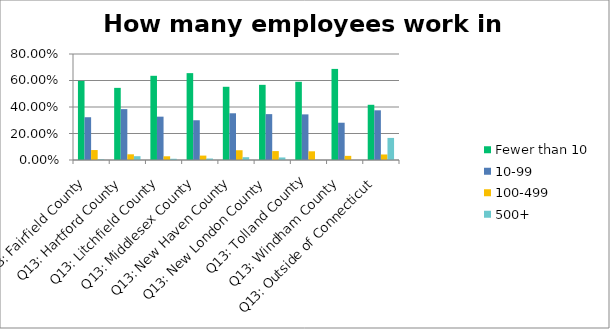
| Category | Fewer than 10 | 10-99 | 100-499 | 500+ |
|---|---|---|---|---|
| Q13: Fairfield County | 0.597 | 0.323 | 0.075 | 0.005 |
| Q13: Hartford County | 0.544 | 0.384 | 0.043 | 0.029 |
| Q13: Litchfield County | 0.636 | 0.327 | 0.028 | 0.009 |
| Q13: Middlesex County | 0.656 | 0.3 | 0.033 | 0.011 |
| Q13: New Haven County | 0.553 | 0.353 | 0.074 | 0.021 |
| Q13: New London County | 0.567 | 0.346 | 0.067 | 0.019 |
| Q13: Tolland County | 0.59 | 0.344 | 0.066 | 0 |
| Q13: Windham County | 0.688 | 0.281 | 0.031 | 0 |
| Q13: Outside of Connecticut | 0.417 | 0.375 | 0.042 | 0.167 |